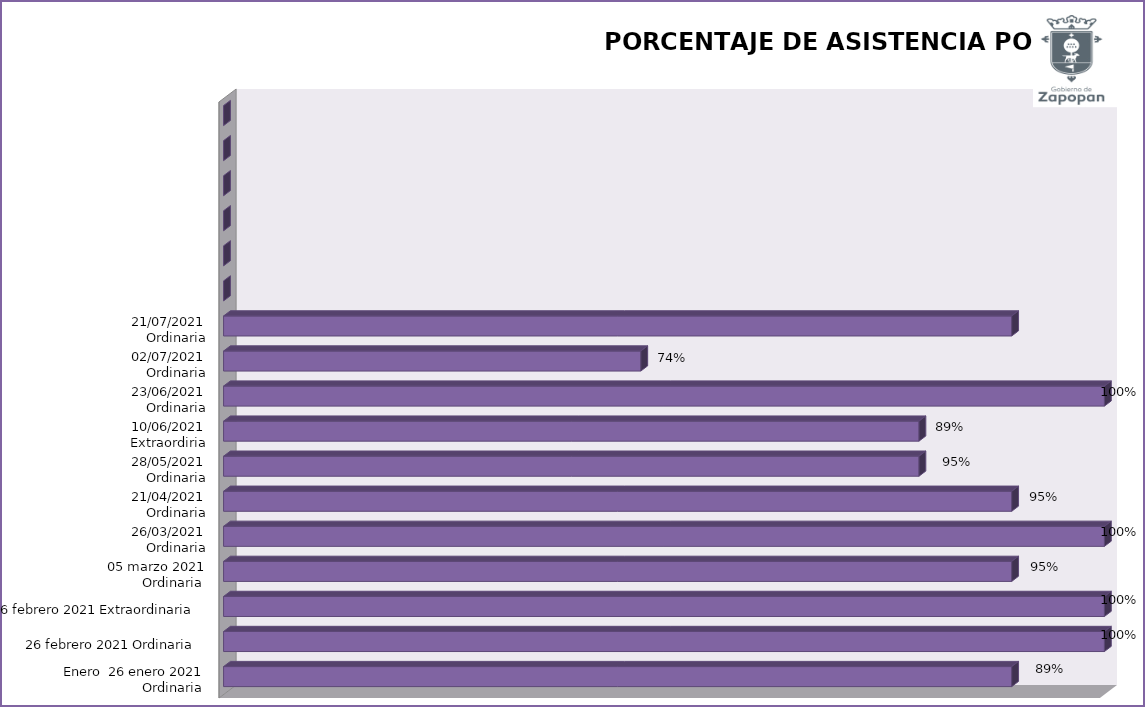
| Category | Series 0 |
|---|---|
| Enero  26 enero 2021
Ordinaria  | 94.737 |
|  26 febrero 2021 Ordinaria  | 100 |
| 26 febrero 2021 Extraordinaria  | 100 |
| 05 marzo 2021
Ordinaria  | 94.737 |
| 26/03/2021
Ordinaria | 100 |
| 21/04/2021
Ordinaria | 94.737 |
| 28/05/2021
Ordinaria | 89.474 |
| 10/06/2021
Extraordiria | 89.474 |
| 23/06/2021
Ordinaria | 100 |
| 02/07/2021
Ordinaria | 73.684 |
| 21/07/2021
Ordinaria | 94.737 |